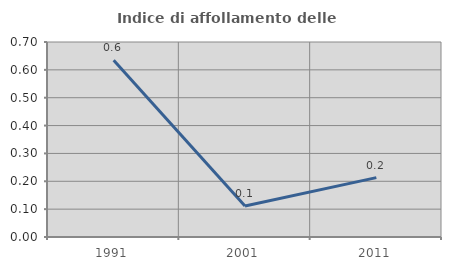
| Category | Indice di affollamento delle abitazioni  |
|---|---|
| 1991.0 | 0.634 |
| 2001.0 | 0.111 |
| 2011.0 | 0.213 |